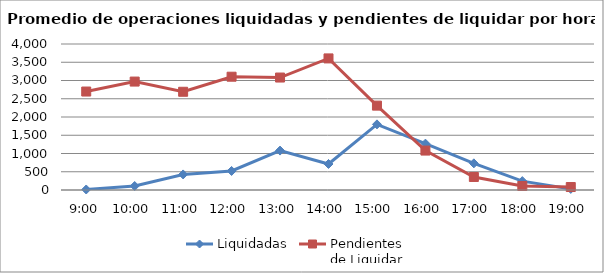
| Category | Liquidadas | Pendientes
de Liquidar |
|---|---|---|
| 0.375 | 13.864 | 2697.591 |
| 0.4166666666666667 | 109.318 | 2970.864 |
| 0.4583333333333333 | 426.727 | 2691 |
| 0.5 | 521.409 | 3103.909 |
| 0.5416666666666666 | 1080.045 | 3081.045 |
| 0.583333333333333 | 712.545 | 3605 |
| 0.625 | 1798.227 | 2311.591 |
| 0.666666666666667 | 1270.364 | 1080.273 |
| 0.708333333333333 | 730.182 | 357 |
| 0.75 | 243.591 | 109.636 |
| 0.791666666666667 | 29.727 | 81.364 |